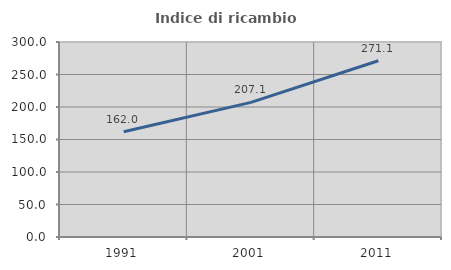
| Category | Indice di ricambio occupazionale  |
|---|---|
| 1991.0 | 161.966 |
| 2001.0 | 207.109 |
| 2011.0 | 271.078 |